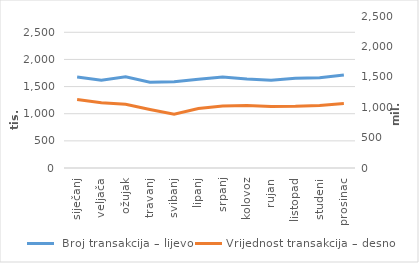
| Category |  Broj transakcija – lijevo |
|---|---|
| siječanj | 1675388 |
| veljača | 1616532 |
| ožujak | 1678512 |
| travanj | 1580711 |
| svibanj | 1589863 |
| lipanj | 1633501 |
| srpanj | 1677887 |
| kolovoz | 1637705 |
| rujan | 1616141 |
| listopad | 1654575 |
| studeni | 1662611 |
| prosinac | 1711805 |